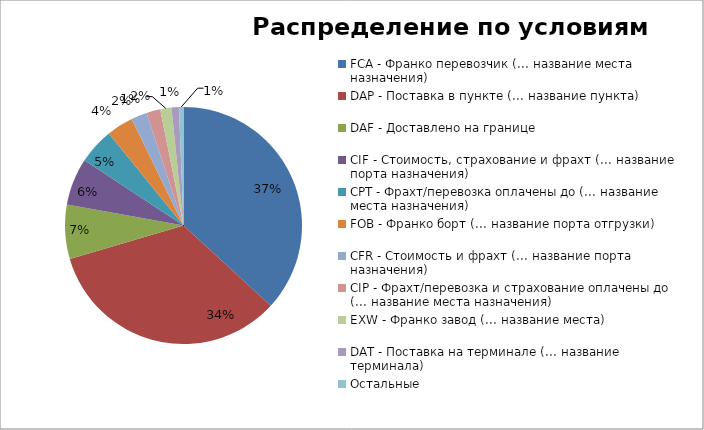
| Category | Стоимость, USD |
|---|---|
| FCA - Франко перевозчик (... название места назначения)  | 6946723.9 |
| DAP - Поставка в пункте (... название пункта)  | 6343129.19 |
| DAF - Доставлено на границе | 1394196.52 |
| CIF - Стоимость, страхование и фрахт (... название порта назначения)  | 1210751.38 |
| CPT - Фрахт/перевозка оплачены до (... название места назначения)  | 922449.58 |
| FOB - Франко борт (... название порта отгрузки)  | 687556.14 |
| CFR - Стоимость и фрахт (... название порта назначения) | 407200.17 |
| CIP - Фрахт/перевозка и страхование оплачены до (... название места назначения)  | 355879.97 |
| EXW - Франко завод (... название места)  | 289504.79 |
| DAT - Поставка на терминале (... название терминала)  | 190827.89 |
| Остальные | 115060.65 |